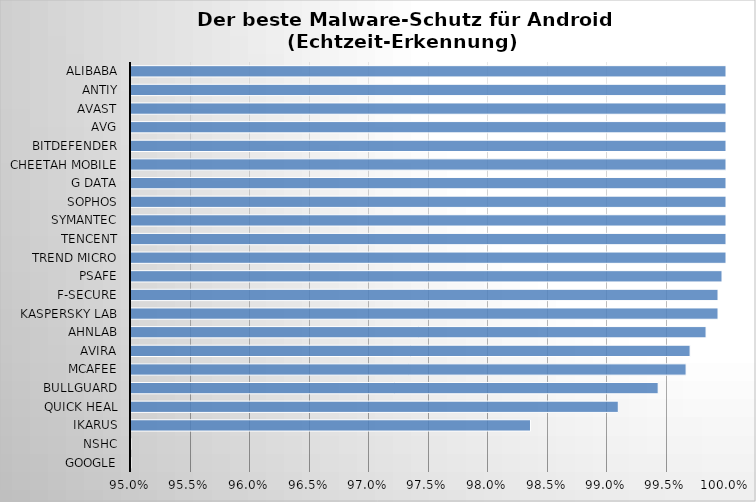
| Category | Series 0 |
|---|---|
| Google | 0.548 |
| NSHC | 0.819 |
| Ikarus | 0.984 |
| Quick Heal | 0.991 |
| BullGuard | 0.994 |
| McAfee | 0.997 |
| Avira | 0.997 |
| AhnLab | 0.998 |
| Kaspersky Lab | 0.999 |
| F-Secure | 0.999 |
| PSafe | 1 |
| Trend Micro | 1 |
| Tencent | 1 |
| Symantec | 1 |
| Sophos | 1 |
| G Data | 1 |
| Cheetah Mobile | 1 |
| Bitdefender | 1 |
| AVG | 1 |
| Avast | 1 |
| Antiy | 1 |
| Alibaba | 1 |